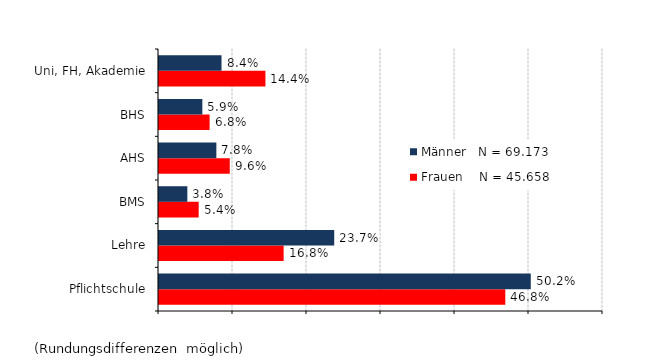
| Category | Frauen    N = 45.658 | Männer   N = 69.173 |
|---|---|---|
| Pflichtschule | 0.468 | 0.502 |
| Lehre | 0.168 | 0.237 |
| BMS | 0.054 | 0.038 |
| AHS | 0.096 | 0.078 |
| BHS | 0.068 | 0.059 |
| Uni, FH, Akademie | 0.144 | 0.084 |